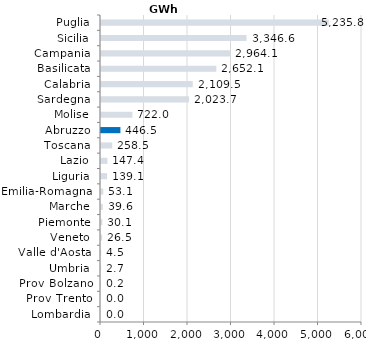
| Category | Series 0 |
|---|---|
| Lombardia | 0 |
| Prov Trento | 0 |
| Prov Bolzano | 0.2 |
| Umbria | 2.7 |
| Valle d'Aosta | 4.5 |
| Veneto | 26.5 |
| Piemonte | 30.1 |
| Marche | 39.6 |
| Emilia-Romagna | 53.1 |
| Liguria | 139.1 |
| Lazio | 147.4 |
| Toscana | 258.5 |
| Abruzzo | 446.5 |
| Molise | 722 |
| Sardegna | 2023.7 |
| Calabria | 2109.5 |
| Basilicata | 2652.1 |
| Campania | 2964.1 |
| Sicilia | 3346.6 |
| Puglia | 5235.8 |